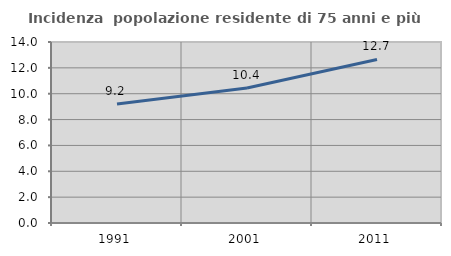
| Category | Incidenza  popolazione residente di 75 anni e più |
|---|---|
| 1991.0 | 9.213 |
| 2001.0 | 10.436 |
| 2011.0 | 12.651 |